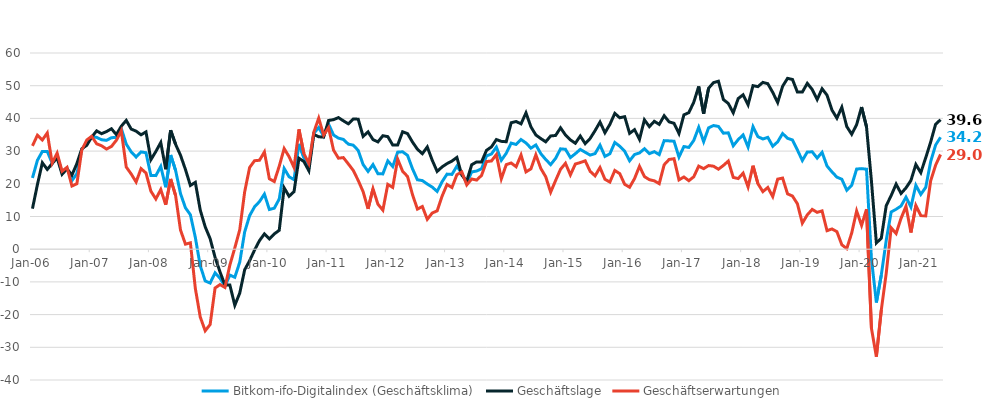
| Category | Bitkom-ifo-Digitalindex (Geschäftsklima) | Geschäftslage | Geschäftserwartungen |
|---|---|---|---|
| 2006-01-01 | 21.79 | 12.4 | 31.6 |
| 2006-02-01 | 27.17 | 19.74 | 34.85 |
| 2006-03-01 | 29.89 | 26.44 | 33.4 |
| 2006-04-01 | 29.91 | 24.4 | 35.55 |
| 2006-05-01 | 26.27 | 26.21 | 26.33 |
| 2006-06-01 | 28.65 | 27.93 | 29.37 |
| 2006-07-01 | 23.37 | 22.91 | 23.84 |
| 2006-08-01 | 24.8 | 24.56 | 25.04 |
| 2006-09-01 | 20.99 | 22.68 | 19.32 |
| 2006-10-01 | 23.09 | 26.2 | 20.02 |
| 2006-11-01 | 30.54 | 30.7 | 30.38 |
| 2006-12-01 | 32.58 | 31.77 | 33.4 |
| 2007-01-01 | 34.41 | 34.3 | 34.52 |
| 2007-02-01 | 34.2 | 36.18 | 32.24 |
| 2007-03-01 | 33.47 | 35.33 | 31.63 |
| 2007-04-01 | 33.28 | 35.97 | 30.63 |
| 2007-05-01 | 34.1 | 36.83 | 31.41 |
| 2007-06-01 | 34.18 | 35.05 | 33.31 |
| 2007-07-01 | 36.91 | 37.61 | 36.22 |
| 2007-08-01 | 32.15 | 39.39 | 25.13 |
| 2007-09-01 | 29.78 | 36.75 | 23.01 |
| 2007-10-01 | 28.19 | 36.1 | 20.55 |
| 2007-11-01 | 29.76 | 34.98 | 24.65 |
| 2007-12-01 | 29.5 | 35.87 | 23.3 |
| 2008-01-01 | 22.51 | 27.38 | 17.73 |
| 2008-02-01 | 22.5 | 29.88 | 15.36 |
| 2008-03-01 | 25.32 | 32.63 | 18.24 |
| 2008-04-01 | 18.95 | 24.45 | 13.59 |
| 2008-05-01 | 28.8 | 36.37 | 21.48 |
| 2008-06-01 | 24.1 | 32.07 | 16.4 |
| 2008-07-01 | 16.99 | 28.72 | 5.85 |
| 2008-08-01 | 12.65 | 24.37 | 1.54 |
| 2008-09-01 | 10.54 | 19.49 | 1.95 |
| 2008-10-01 | 3.6 | 20.45 | -11.97 |
| 2008-11-01 | -5.09 | 11.94 | -20.75 |
| 2008-12-01 | -9.71 | 6.85 | -24.95 |
| 2009-01-01 | -10.35 | 3.23 | -23.03 |
| 2009-02-01 | -7.24 | -2.48 | -11.88 |
| 2009-03-01 | -8.89 | -6.95 | -10.82 |
| 2009-04-01 | -11.32 | -10.94 | -11.69 |
| 2009-05-01 | -7.92 | -10.96 | -4.84 |
| 2009-06-01 | -8.58 | -17.15 | 0.4 |
| 2009-07-01 | -3.98 | -13.42 | 5.93 |
| 2009-08-01 | 5.29 | -6.29 | 17.56 |
| 2009-09-01 | 10.25 | -3.52 | 24.99 |
| 2009-10-01 | 12.96 | -0.27 | 27.06 |
| 2009-11-01 | 14.56 | 2.63 | 27.2 |
| 2009-12-01 | 16.85 | 4.69 | 29.74 |
| 2010-01-01 | 12.14 | 3.14 | 21.54 |
| 2010-02-01 | 12.54 | 4.68 | 20.69 |
| 2010-03-01 | 15.35 | 5.78 | 25.37 |
| 2010-04-01 | 24.69 | 18.76 | 30.78 |
| 2010-05-01 | 22.15 | 16.19 | 28.28 |
| 2010-06-01 | 21.26 | 17.6 | 24.99 |
| 2010-07-01 | 32.19 | 27.81 | 36.65 |
| 2010-08-01 | 28.02 | 26.81 | 29.24 |
| 2010-09-01 | 25.1 | 24 | 26.21 |
| 2010-10-01 | 35.41 | 35.1 | 35.73 |
| 2010-11-01 | 37.21 | 34.38 | 40.08 |
| 2010-12-01 | 34.59 | 34.28 | 34.9 |
| 2011-01-01 | 38.27 | 39.36 | 37.19 |
| 2011-02-01 | 34.93 | 39.62 | 30.32 |
| 2011-03-01 | 33.96 | 40.24 | 27.83 |
| 2011-04-01 | 33.57 | 39.26 | 28.01 |
| 2011-05-01 | 32.13 | 38.34 | 26.09 |
| 2011-06-01 | 31.82 | 39.8 | 24.1 |
| 2011-07-01 | 30.21 | 39.77 | 21.04 |
| 2011-08-01 | 25.89 | 34.5 | 17.59 |
| 2011-09-01 | 23.79 | 35.88 | 12.32 |
| 2011-10-01 | 25.88 | 33.53 | 18.48 |
| 2011-11-01 | 23.08 | 32.81 | 13.76 |
| 2011-12-01 | 23.03 | 34.7 | 11.94 |
| 2012-01-01 | 27.01 | 34.43 | 19.82 |
| 2012-02-01 | 25.29 | 31.86 | 18.9 |
| 2012-03-01 | 29.69 | 31.85 | 27.55 |
| 2012-04-01 | 29.79 | 35.91 | 23.84 |
| 2012-05-01 | 28.69 | 35.35 | 22.23 |
| 2012-06-01 | 24.61 | 32.78 | 16.73 |
| 2012-07-01 | 21.23 | 30.58 | 12.26 |
| 2012-08-01 | 20.99 | 29.2 | 13.06 |
| 2012-09-01 | 19.93 | 31.27 | 9.14 |
| 2012-10-01 | 18.99 | 27.22 | 11.06 |
| 2012-11-01 | 17.67 | 23.78 | 11.73 |
| 2012-12-01 | 20.64 | 25.16 | 16.21 |
| 2013-01-01 | 22.96 | 26.17 | 19.8 |
| 2013-02-01 | 22.87 | 26.96 | 18.86 |
| 2013-03-01 | 25.4 | 28.06 | 22.78 |
| 2013-04-01 | 23.13 | 22.63 | 23.63 |
| 2013-05-01 | 20.24 | 20.81 | 19.66 |
| 2013-06-01 | 23.64 | 25.83 | 21.47 |
| 2013-07-01 | 23.9 | 26.7 | 21.14 |
| 2013-08-01 | 24.62 | 26.69 | 22.57 |
| 2013-09-01 | 28.52 | 30.24 | 26.8 |
| 2013-10-01 | 29.12 | 31.28 | 26.98 |
| 2013-11-01 | 31.22 | 33.53 | 28.94 |
| 2013-12-01 | 27.18 | 32.98 | 21.52 |
| 2014-01-01 | 29.33 | 32.86 | 25.85 |
| 2014-02-01 | 32.44 | 38.67 | 26.36 |
| 2014-03-01 | 32.03 | 39.05 | 25.22 |
| 2014-04-01 | 33.53 | 38.34 | 28.81 |
| 2014-05-01 | 32.49 | 41.69 | 23.64 |
| 2014-06-01 | 30.91 | 37.43 | 24.57 |
| 2014-07-01 | 31.88 | 34.93 | 28.87 |
| 2014-08-01 | 29.23 | 33.84 | 24.71 |
| 2014-09-01 | 27.43 | 32.84 | 22.15 |
| 2014-10-01 | 25.87 | 34.63 | 17.44 |
| 2014-11-01 | 27.78 | 34.78 | 21 |
| 2014-12-01 | 30.69 | 37.12 | 24.43 |
| 2015-01-01 | 30.56 | 34.94 | 26.27 |
| 2015-02-01 | 28.02 | 33.44 | 22.73 |
| 2015-03-01 | 29.2 | 32.4 | 26.05 |
| 2015-04-01 | 30.52 | 34.61 | 26.49 |
| 2015-05-01 | 29.64 | 32.28 | 27.03 |
| 2015-06-01 | 28.78 | 33.86 | 23.82 |
| 2015-07-01 | 29.24 | 36.27 | 22.43 |
| 2015-08-01 | 31.82 | 38.88 | 24.97 |
| 2015-09-01 | 28.38 | 35.61 | 21.38 |
| 2015-10-01 | 29.18 | 38.17 | 20.53 |
| 2015-11-01 | 32.64 | 41.54 | 24.07 |
| 2015-12-01 | 31.49 | 40.19 | 23.1 |
| 2016-01-01 | 29.95 | 40.53 | 19.84 |
| 2016-02-01 | 27.04 | 35.43 | 18.95 |
| 2016-03-01 | 28.96 | 36.56 | 21.6 |
| 2016-04-01 | 29.44 | 33.59 | 25.36 |
| 2016-05-01 | 30.72 | 39.56 | 22.2 |
| 2016-06-01 | 29.22 | 37.48 | 21.26 |
| 2016-07-01 | 29.83 | 39.11 | 20.91 |
| 2016-08-01 | 28.93 | 38.17 | 20.04 |
| 2016-09-01 | 33.2 | 40.82 | 25.82 |
| 2016-10-01 | 33.12 | 38.94 | 27.44 |
| 2016-11-01 | 33.02 | 38.5 | 27.67 |
| 2016-12-01 | 28.18 | 35.39 | 21.19 |
| 2017-01-01 | 31.39 | 41.08 | 22.09 |
| 2017-02-01 | 31.13 | 41.77 | 20.95 |
| 2017-03-01 | 33.27 | 44.95 | 22.15 |
| 2017-04-01 | 37.28 | 49.77 | 25.41 |
| 2017-05-01 | 32.88 | 41.43 | 24.63 |
| 2017-06-01 | 37.11 | 49.22 | 25.58 |
| 2017-07-01 | 37.82 | 50.94 | 25.38 |
| 2017-08-01 | 37.54 | 51.37 | 24.47 |
| 2017-09-01 | 35.48 | 45.77 | 25.61 |
| 2017-10-01 | 35.59 | 44.56 | 26.95 |
| 2017-11-01 | 31.62 | 41.71 | 21.96 |
| 2017-12-01 | 33.52 | 46.07 | 21.6 |
| 2018-01-01 | 34.94 | 47.23 | 23.26 |
| 2018-02-01 | 31.25 | 44.15 | 19.03 |
| 2018-03-01 | 37.46 | 50.01 | 25.54 |
| 2018-04-01 | 34.41 | 49.72 | 20.03 |
| 2018-05-01 | 33.71 | 51.01 | 17.6 |
| 2018-06-01 | 34.21 | 50.61 | 18.88 |
| 2018-07-01 | 31.48 | 47.96 | 16.09 |
| 2018-08-01 | 32.84 | 44.85 | 21.43 |
| 2018-09-01 | 35.37 | 49.82 | 21.75 |
| 2018-10-01 | 33.92 | 52.25 | 16.93 |
| 2018-11-01 | 33.4 | 51.91 | 16.25 |
| 2018-12-01 | 30.33 | 48.05 | 13.89 |
| 2019-01-01 | 27.13 | 48.05 | 7.96 |
| 2019-02-01 | 29.73 | 50.72 | 10.5 |
| 2019-03-01 | 29.78 | 48.85 | 12.17 |
| 2019-04-01 | 27.87 | 45.77 | 11.27 |
| 2019-05-01 | 29.63 | 49.07 | 11.71 |
| 2019-06-01 | 25.43 | 47.1 | 5.66 |
| 2019-07-01 | 23.64 | 42.56 | 6.19 |
| 2019-08-01 | 22.04 | 40.07 | 5.37 |
| 2019-09-01 | 21.39 | 43.42 | 1.35 |
| 2019-10-01 | 18.05 | 37.51 | 0.18 |
| 2019-11-01 | 19.53 | 35.15 | 4.95 |
| 2019-12-01 | 24.51 | 38.1 | 11.7 |
| 2020-01-01 | 24.64 | 43.47 | 7.27 |
| 2020-02-01 | 24.47 | 37.43 | 12.22 |
| 2020-03-01 | -2.96 | 20.83 | -24.19 |
| 2020-04-01 | -16.3 | 1.9 | -32.86 |
| 2020-05-01 | -7.89 | 3.39 | -18.54 |
| 2020-06-01 | 2.74 | 13.32 | -7.31 |
| 2020-07-01 | 11.41 | 16.42 | 6.51 |
| 2020-08-01 | 12.22 | 19.91 | 4.8 |
| 2020-09-01 | 13.21 | 17.05 | 9.43 |
| 2020-10-01 | 15.91 | 18.75 | 13.11 |
| 2020-11-01 | 12.91 | 21.01 | 5.1 |
| 2020-12-01 | 19.55 | 25.91 | 13.37 |
| 2021-01-01 | 16.75 | 23.41 | 10.3 |
| 2021-02-01 | 18.89 | 27.95 | 10.18 |
| 2021-03-01 | 26.78 | 32.78 | 20.93 |
| 2021-04-01 | 31.86 | 38.2 | 25.69 |
| 2021-05-01 | 34.22 | 39.6 | 28.96 |